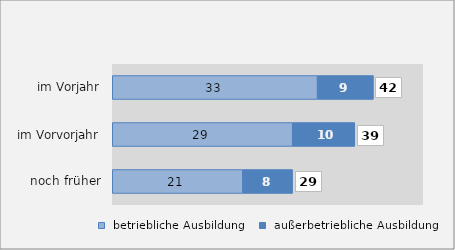
| Category |  betriebliche Ausbildung |  außerbetriebliche Ausbildung |
|---|---|---|
|  noch früher | 21 | 8 |
|  im Vorvorjahr | 29 | 10 |
|  im Vorjahr | 33 | 9 |